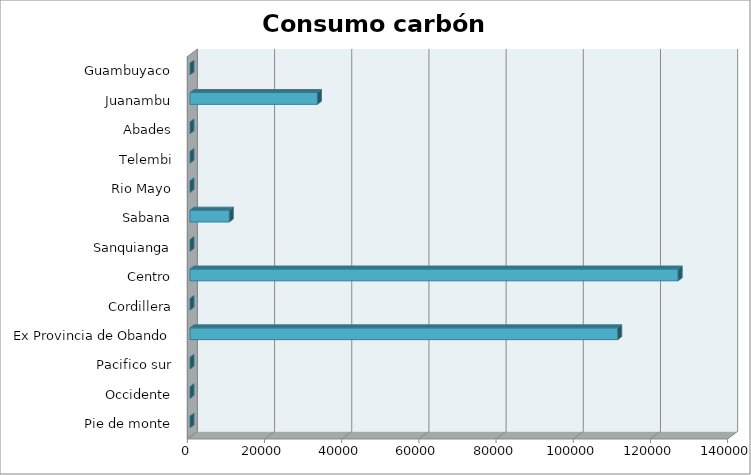
| Category | Series 0 |
|---|---|
| Pie de monte | 0 |
| Occidente | 0 |
| Pacifico sur | 0 |
| Ex Provincia de Obando | 110843.418 |
| Cordillera | 0 |
| Centro | 126492.382 |
| Sanquianga | 0 |
| Sabana | 10191.768 |
| Rio Mayo | 0 |
| Telembi | 0 |
| Abades | 0 |
| Juanambu | 33016.396 |
| Guambuyaco | 0 |